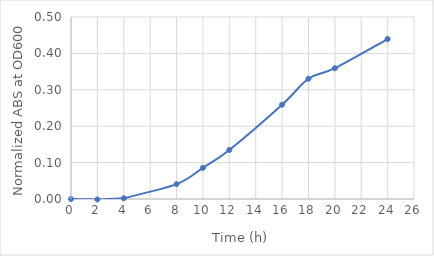
| Category | Series 0 |
|---|---|
| 0.0 | 0 |
| 2.0 | -0.001 |
| 4.0 | 0.002 |
| 8.0 | 0.041 |
| 10.0 | 0.086 |
| 12.0 | 0.135 |
| 16.0 | 0.259 |
| 18.0 | 0.33 |
| 20.0 | 0.359 |
| 24.0 | 0.439 |